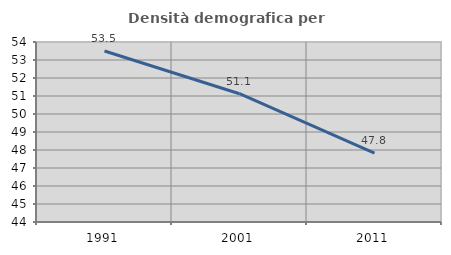
| Category | Densità demografica |
|---|---|
| 1991.0 | 53.501 |
| 2001.0 | 51.126 |
| 2011.0 | 47.828 |